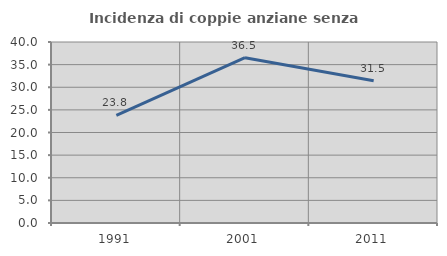
| Category | Incidenza di coppie anziane senza figli  |
|---|---|
| 1991.0 | 23.81 |
| 2001.0 | 36.538 |
| 2011.0 | 31.452 |